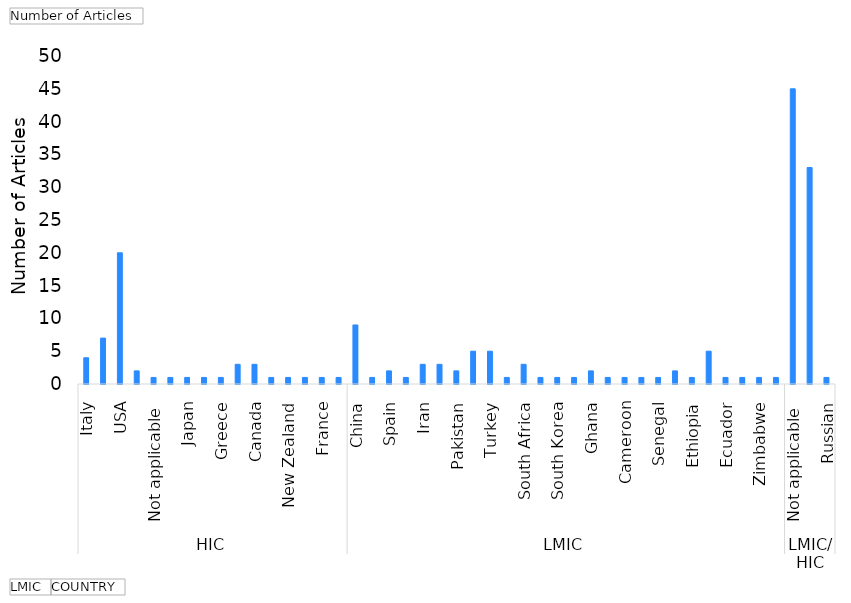
| Category | Total |
|---|---|
| 0 | 4 |
| 1 | 7 |
| 2 | 20 |
| 3 | 2 |
| 4 | 1 |
| 5 | 1 |
| 6 | 1 |
| 7 | 1 |
| 8 | 1 |
| 9 | 3 |
| 10 | 3 |
| 11 | 1 |
| 12 | 1 |
| 13 | 1 |
| 14 | 1 |
| 15 | 1 |
| 16 | 9 |
| 17 | 1 |
| 18 | 2 |
| 19 | 1 |
| 20 | 3 |
| 21 | 3 |
| 22 | 2 |
| 23 | 5 |
| 24 | 5 |
| 25 | 1 |
| 26 | 3 |
| 27 | 1 |
| 28 | 1 |
| 29 | 1 |
| 30 | 2 |
| 31 | 1 |
| 32 | 1 |
| 33 | 1 |
| 34 | 1 |
| 35 | 2 |
| 36 | 1 |
| 37 | 5 |
| 38 | 1 |
| 39 | 1 |
| 40 | 1 |
| 41 | 1 |
| 42 | 45 |
| 43 | 33 |
| 44 | 1 |